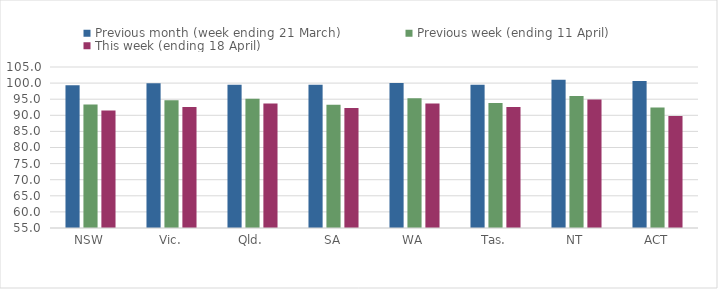
| Category | Previous month (week ending 21 March) | Previous week (ending 11 April) | This week (ending 18 April) |
|---|---|---|---|
| NSW | 99.363 | 93.373 | 91.513 |
| Vic. | 99.944 | 94.647 | 92.588 |
| Qld. | 99.468 | 95.164 | 93.693 |
| SA | 99.452 | 93.282 | 92.278 |
| WA | 100.065 | 95.316 | 93.681 |
| Tas. | 99.468 | 93.853 | 92.6 |
| NT | 101.04 | 95.969 | 94.88 |
| ACT | 100.682 | 92.418 | 89.757 |